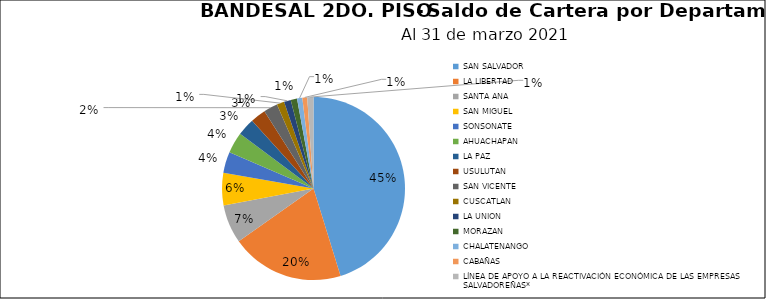
| Category | Saldo | Créditos |
|---|---|---|
| SAN SALVADOR | 142.909 | 5168 |
| LA LIBERTAD | 63.16 | 1643 |
| SANTA ANA | 21.548 | 1199 |
| SAN MIGUEL | 18.023 | 1465 |
| SONSONATE | 11.799 | 755 |
| AHUACHAPAN | 11.755 | 520 |
| LA PAZ | 9.827 | 947 |
| USULUTAN | 8.509 | 943 |
| SAN VICENTE | 7.817 | 568 |
| CUSCATLAN | 4.174 | 314 |
| LA UNION | 3.829 | 381 |
| MORAZAN | 3.522 | 434 |
| CHALATENANGO | 2.945 | 149 |
| CABAÑAS | 2.718 | 146 |
| LÍNEA DE APOYO A LA REACTIVACIÓN ECONÓMICA DE LAS EMPRESAS SALVADOREÑAS* | 3.475 | 0 |